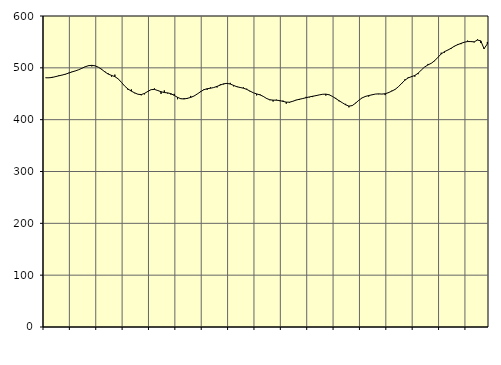
| Category | Piggar | Series 1 |
|---|---|---|
| nan | 480.3 | 480.8 |
| 87.0 | 480.5 | 480.75 |
| 87.0 | 482.5 | 481.49 |
| 87.0 | 482.3 | 483.02 |
| nan | 485.6 | 484.6 |
| 88.0 | 485.9 | 486.1 |
| 88.0 | 487.1 | 487.77 |
| 88.0 | 490.5 | 489.87 |
| nan | 492.6 | 492.14 |
| 89.0 | 493.8 | 494.07 |
| 89.0 | 496.4 | 496.28 |
| 89.0 | 499 | 499.15 |
| nan | 502.5 | 502.1 |
| 90.0 | 503.6 | 504.16 |
| 90.0 | 502.8 | 504.78 |
| 90.0 | 504.2 | 503.87 |
| nan | 501.3 | 501.18 |
| 91.0 | 497.9 | 496.98 |
| 91.0 | 492.7 | 492.05 |
| 91.0 | 489.1 | 487.88 |
| nan | 482.9 | 485.37 |
| 92.0 | 486.9 | 483.03 |
| 92.0 | 478.5 | 478.78 |
| 92.0 | 472 | 471.93 |
| nan | 464.7 | 464.64 |
| 93.0 | 457.4 | 459.09 |
| 93.0 | 458.4 | 455 |
| 93.0 | 451 | 451.74 |
| nan | 449.1 | 449.03 |
| 94.0 | 447 | 448.38 |
| 94.0 | 448.8 | 450.68 |
| 94.0 | 455.3 | 454.5 |
| nan | 457.6 | 457.9 |
| 95.0 | 460.3 | 458.4 |
| 95.0 | 457 | 456.24 |
| 95.0 | 449.7 | 453.9 |
| nan | 456.4 | 452.33 |
| 96.0 | 450.5 | 451.67 |
| 96.0 | 448.2 | 450.16 |
| 96.0 | 449.8 | 446.8 |
| nan | 439.4 | 443.11 |
| 97.0 | 441.3 | 440.37 |
| 97.0 | 441.7 | 439.96 |
| 97.0 | 440.1 | 441.18 |
| nan | 445.8 | 442.87 |
| 98.0 | 445.6 | 445.59 |
| 98.0 | 449.7 | 449.51 |
| 98.0 | 455.1 | 453.93 |
| nan | 458.7 | 457.76 |
| 99.0 | 457.6 | 459.71 |
| 99.0 | 462.3 | 460.67 |
| 99.0 | 462 | 461.98 |
| nan | 462.1 | 464.2 |
| 0.0 | 468.2 | 466.81 |
| 0.0 | 468 | 469.2 |
| 0.0 | 469.1 | 470.01 |
| nan | 471 | 468.73 |
| 1.0 | 464.3 | 466.13 |
| 1.0 | 464.6 | 463.54 |
| 1.0 | 462.7 | 462.09 |
| nan | 462.2 | 460.71 |
| 2.0 | 459.7 | 458.42 |
| 2.0 | 454.4 | 455.12 |
| 2.0 | 451.9 | 451.87 |
| nan | 446.8 | 449.71 |
| 3.0 | 449.2 | 447.92 |
| 3.0 | 445.3 | 444.98 |
| 3.0 | 440.4 | 441.01 |
| nan | 437.6 | 438.41 |
| 4.0 | 435 | 437.69 |
| 4.0 | 438.6 | 437.55 |
| 4.0 | 435.7 | 436.87 |
| nan | 436.8 | 435.29 |
| 5.0 | 430.8 | 433.82 |
| 5.0 | 432.7 | 433.72 |
| 5.0 | 435.3 | 435.51 |
| nan | 438.2 | 437.81 |
| 6.0 | 438.1 | 439.36 |
| 6.0 | 440.4 | 440.75 |
| 6.0 | 444 | 442.36 |
| nan | 443 | 443.87 |
| 7.0 | 443.6 | 445.15 |
| 7.0 | 445.8 | 446.34 |
| 7.0 | 447.6 | 447.76 |
| nan | 449.2 | 448.97 |
| 8.0 | 446.5 | 449.27 |
| 8.0 | 447.5 | 448.02 |
| 8.0 | 444.5 | 444.87 |
| nan | 442 | 440.78 |
| 9.0 | 435.5 | 436.61 |
| 9.0 | 432.6 | 432.68 |
| 9.0 | 430.5 | 428.74 |
| nan | 423.8 | 426.16 |
| 10.0 | 426.7 | 427.13 |
| 10.0 | 432.5 | 431.69 |
| 10.0 | 437.6 | 437.37 |
| nan | 442.3 | 441.95 |
| 11.0 | 445.6 | 444.8 |
| 11.0 | 444.6 | 446.51 |
| 11.0 | 448.2 | 447.89 |
| nan | 449.4 | 449.35 |
| 12.0 | 449.1 | 449.78 |
| 12.0 | 449.3 | 449.42 |
| 12.0 | 447.4 | 450.03 |
| nan | 453.1 | 452.1 |
| 13.0 | 455.9 | 455.04 |
| 13.0 | 457.9 | 458.33 |
| 13.0 | 463.3 | 463.39 |
| nan | 469 | 470.01 |
| 14.0 | 477.9 | 476.19 |
| 14.0 | 482.1 | 480.63 |
| 14.0 | 484.1 | 482.95 |
| nan | 483 | 485.29 |
| 15.0 | 487.8 | 489.67 |
| 15.0 | 496.2 | 496.01 |
| 15.0 | 501.7 | 501.78 |
| nan | 507.5 | 505.64 |
| 16.0 | 509 | 508.83 |
| 16.0 | 512.9 | 513.65 |
| 16.0 | 520.5 | 520.27 |
| nan | 529.2 | 526.81 |
| 17.0 | 529.4 | 531.28 |
| 17.0 | 534.5 | 534.21 |
| 17.0 | 536.5 | 537.7 |
| nan | 541 | 541.74 |
| 18.0 | 546 | 544.7 |
| 18.0 | 545.7 | 547.13 |
| 18.0 | 548.9 | 549.47 |
| nan | 552.5 | 550.71 |
| 19.0 | 551.2 | 550.63 |
| 19.0 | 549.1 | 550.12 |
| 19.0 | 554.9 | 553.57 |
| nan | 547.9 | 552.09 |
| 20.0 | 538.3 | 536.83 |
| 20.0 | 549.9 | 546.17 |